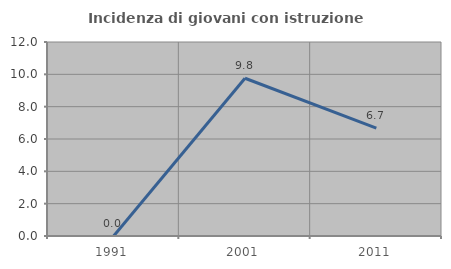
| Category | Incidenza di giovani con istruzione universitaria |
|---|---|
| 1991.0 | 0 |
| 2001.0 | 9.756 |
| 2011.0 | 6.667 |